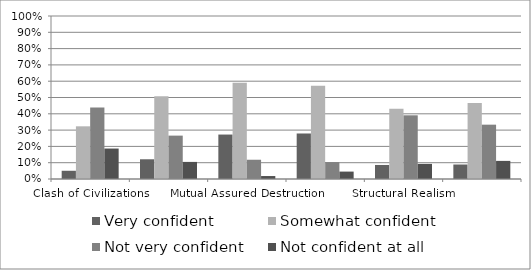
| Category | Very confident | Somewhat confident | Not very confident | Not confident at all |
|---|---|---|---|---|
| Clash of Civilizations | 0.051 | 0.323 | 0.439 | 0.187 |
| Democratic Peace Theory | 0.121 | 0.508 | 0.266 | 0.105 |
| Mutual Assured Destruction | 0.273 | 0.591 | 0.118 | 0.018 |
| Population Centric COIN | 0.279 | 0.571 | 0.104 | 0.045 |
| Structural Realism | 0.086 | 0.43 | 0.391 | 0.093 |
| Expected Utility | 0.089 | 0.467 | 0.333 | 0.111 |